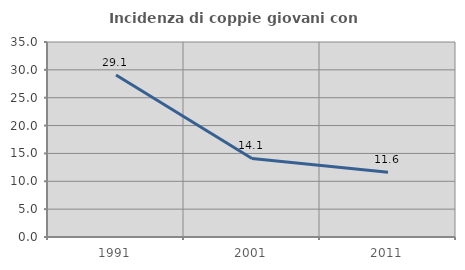
| Category | Incidenza di coppie giovani con figli |
|---|---|
| 1991.0 | 29.073 |
| 2001.0 | 14.092 |
| 2011.0 | 11.641 |